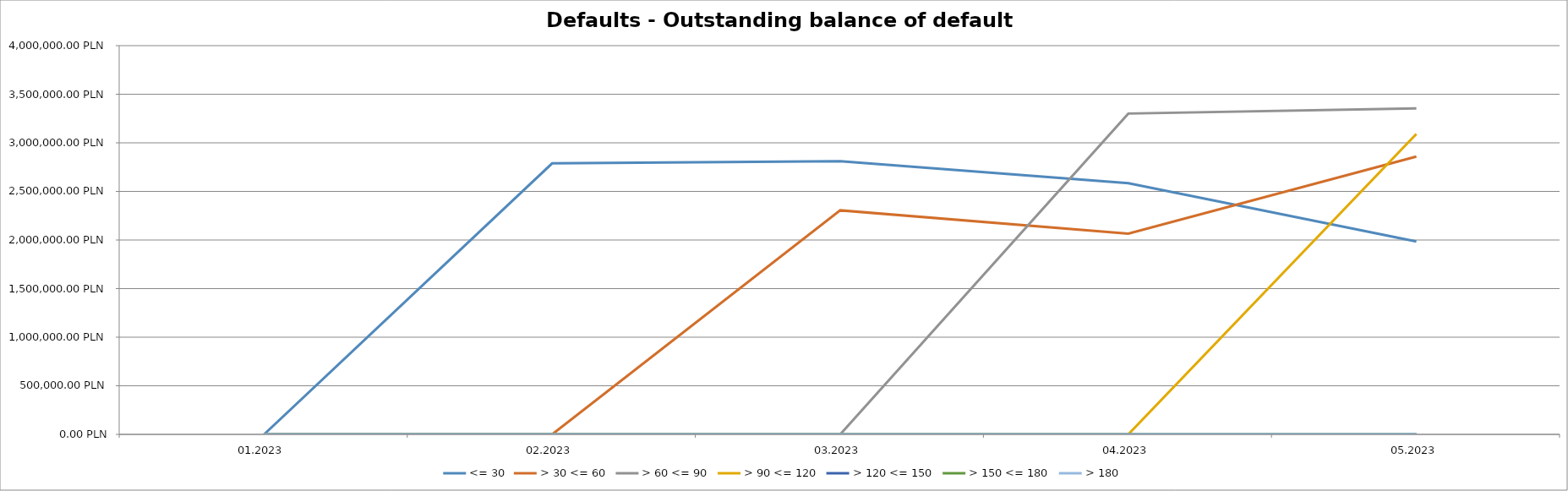
| Category | <= 30 | > 30 <= 60 | > 60 <= 90 | > 90 <= 120 | > 120 <= 150 | > 150 <= 180 | > 180 |
|---|---|---|---|---|---|---|---|
| 01.2023 | 0 | 0 | 0 | 0 | 0 | 0 | 0 |
| 02.2023 | 2788519.82 | 0 | 0 | 0 | 0 | 0 | 0 |
| 03.2023 | 2811517.14 | 2305154.07 | 0 | 0 | 0 | 0 | 0 |
| 04.2023 | 2584791.3 | 2064675.87 | 3301101.31 | 0 | 0 | 0 | 0 |
| 05.2023 | 1985441.56 | 2858398.5 | 3353485.78 | 3091988.77 | 0 | 0 | 0 |